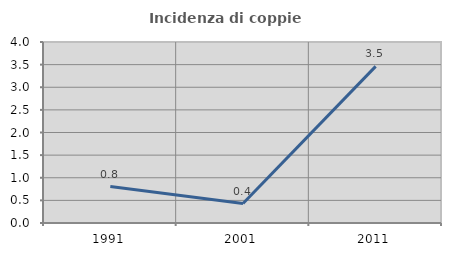
| Category | Incidenza di coppie miste |
|---|---|
| 1991.0 | 0.806 |
| 2001.0 | 0.429 |
| 2011.0 | 3.462 |